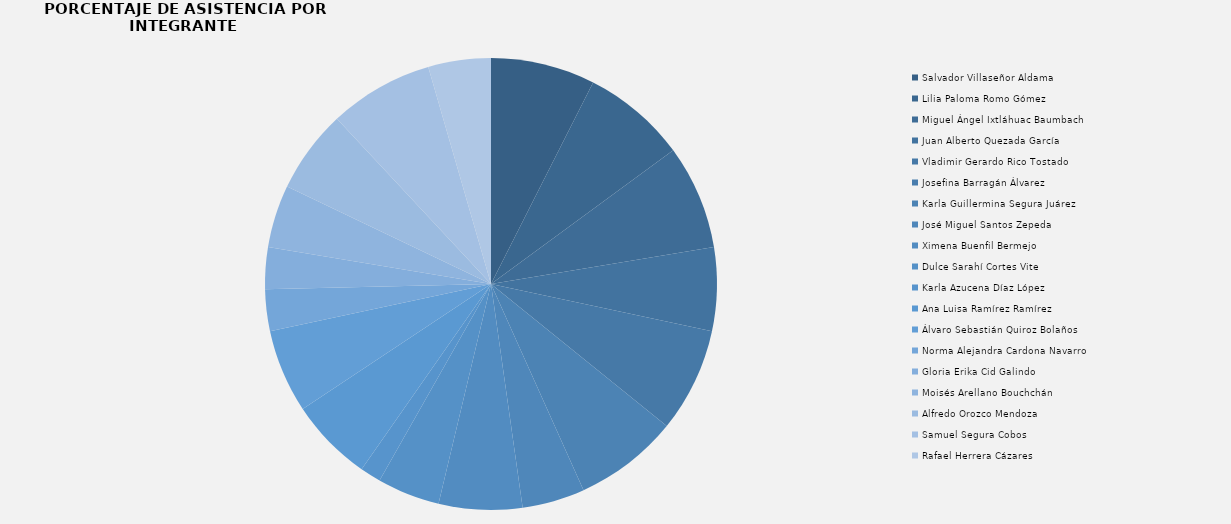
| Category | Salvador Villaseñor Aldama  |
|---|---|
| Salvador Villaseñor Aldama  | 5 |
| Lilia Paloma Romo Gómez  | 5 |
| Miguel Ángel Ixtláhuac Baumbach  | 5 |
| Juan Alberto Quezada García  | 4 |
| Vladimir Gerardo Rico Tostado | 5 |
| Josefina Barragán Álvarez  | 0 |
| Karla Guillermina Segura Juárez | 5 |
| José Miguel Santos Zepeda  | 3 |
| Ximena Buenfil Bermejo | 4 |
| Dulce Sarahí Cortes Vite  | 3 |
| Karla Azucena Díaz López  | 1 |
| Ana Luisa Ramírez Ramírez | 4 |
| Álvaro Sebastián Quiroz Bolaños | 4 |
| Norma Alejandra Cardona Navarro  | 2 |
| Gloria Erika Cid Galindo  | 2 |
| Moisés Arellano Bouchchán | 3 |
| Alfredo Orozco Mendoza  | 4 |
| Samuel Segura Cobos  | 5 |
| Rafael Herrera Cázares | 3 |